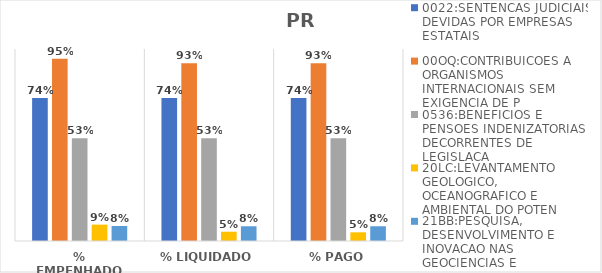
| Category | 0022:SENTENCAS JUDICIAIS DEVIDAS POR EMPRESAS ESTATAIS | 00OQ:CONTRIBUICOES A ORGANISMOS INTERNACIONAIS SEM EXIGENCIA DE P | 0536:BENEFICIOS E PENSOES INDENIZATORIAS DECORRENTES DE LEGISLACA | 20LC:LEVANTAMENTO GEOLOGICO, OCEANOGRAFICO E AMBIENTAL DO POTEN | 21BB:PESQUISA, DESENVOLVIMENTO E INOVACAO NAS GEOCIENCIAS E |
|---|---|---|---|---|---|
| % EMPENHADO | 0.744 | 0.95 | 0.535 | 0.085 | 0.078 |
| % LIQUIDADO | 0.744 | 0.926 | 0.535 | 0.048 | 0.077 |
| % PAGO | 0.744 | 0.926 | 0.535 | 0.045 | 0.077 |